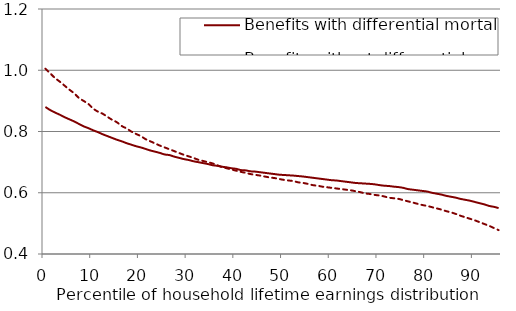
| Category | Benefits with differential mortality | Benefits without differential mortality |
|---|---|---|
| 0.0 | 0.88 | 1.005 |
| 1.0 | 0.87 | 0.99 |
| 2.0 | 0.862 | 0.975 |
| 3.0 | 0.855 | 0.963 |
| 4.0 | 0.847 | 0.95 |
| 5.0 | 0.84 | 0.937 |
| 6.0 | 0.833 | 0.925 |
| 7.0 | 0.825 | 0.91 |
| 8.0 | 0.817 | 0.9 |
| 9.0 | 0.811 | 0.89 |
| 10.0 | 0.804 | 0.875 |
| 11.0 | 0.798 | 0.865 |
| 12.0 | 0.791 | 0.858 |
| 13.0 | 0.785 | 0.848 |
| 14.0 | 0.779 | 0.838 |
| 15.0 | 0.773 | 0.83 |
| 16.0 | 0.768 | 0.818 |
| 17.0 | 0.762 | 0.81 |
| 18.0 | 0.757 | 0.8 |
| 19.0 | 0.752 | 0.792 |
| 20.0 | 0.748 | 0.785 |
| 21.0 | 0.743 | 0.775 |
| 22.0 | 0.738 | 0.768 |
| 23.0 | 0.734 | 0.761 |
| 24.0 | 0.73 | 0.754 |
| 25.0 | 0.725 | 0.748 |
| 26.0 | 0.723 | 0.742 |
| 27.0 | 0.718 | 0.736 |
| 28.0 | 0.714 | 0.73 |
| 29.0 | 0.71 | 0.724 |
| 30.0 | 0.707 | 0.719 |
| 31.0 | 0.703 | 0.714 |
| 32.0 | 0.7 | 0.708 |
| 33.0 | 0.697 | 0.704 |
| 34.0 | 0.694 | 0.7 |
| 35.0 | 0.69 | 0.696 |
| 36.0 | 0.688 | 0.69 |
| 37.0 | 0.685 | 0.684 |
| 38.0 | 0.683 | 0.68 |
| 39.0 | 0.68 | 0.676 |
| 40.0 | 0.678 | 0.672 |
| 41.0 | 0.674 | 0.668 |
| 42.0 | 0.673 | 0.665 |
| 43.0 | 0.67 | 0.661 |
| 44.0 | 0.669 | 0.658 |
| 45.0 | 0.667 | 0.656 |
| 46.0 | 0.665 | 0.653 |
| 47.0 | 0.663 | 0.65 |
| 48.0 | 0.661 | 0.648 |
| 49.0 | 0.659 | 0.645 |
| 50.0 | 0.658 | 0.642 |
| 51.0 | 0.657 | 0.64 |
| 52.0 | 0.656 | 0.638 |
| 53.0 | 0.655 | 0.634 |
| 54.0 | 0.653 | 0.632 |
| 55.0 | 0.651 | 0.629 |
| 56.0 | 0.649 | 0.625 |
| 57.0 | 0.647 | 0.623 |
| 58.0 | 0.645 | 0.62 |
| 59.0 | 0.643 | 0.618 |
| 60.0 | 0.641 | 0.616 |
| 61.0 | 0.64 | 0.614 |
| 62.0 | 0.638 | 0.612 |
| 63.0 | 0.636 | 0.61 |
| 64.0 | 0.634 | 0.608 |
| 65.0 | 0.632 | 0.605 |
| 66.0 | 0.631 | 0.602 |
| 67.0 | 0.63 | 0.598 |
| 68.0 | 0.629 | 0.596 |
| 69.0 | 0.628 | 0.593 |
| 70.0 | 0.625 | 0.591 |
| 71.0 | 0.623 | 0.588 |
| 72.0 | 0.622 | 0.584 |
| 73.0 | 0.62 | 0.582 |
| 74.0 | 0.618 | 0.58 |
| 75.0 | 0.616 | 0.576 |
| 76.0 | 0.612 | 0.572 |
| 77.0 | 0.61 | 0.568 |
| 78.0 | 0.608 | 0.564 |
| 79.0 | 0.606 | 0.56 |
| 80.0 | 0.604 | 0.557 |
| 81.0 | 0.6 | 0.553 |
| 82.0 | 0.597 | 0.549 |
| 83.0 | 0.594 | 0.545 |
| 84.0 | 0.59 | 0.54 |
| 85.0 | 0.587 | 0.536 |
| 86.0 | 0.584 | 0.531 |
| 87.0 | 0.58 | 0.525 |
| 88.0 | 0.577 | 0.52 |
| 89.0 | 0.574 | 0.515 |
| 90.0 | 0.57 | 0.51 |
| 91.0 | 0.566 | 0.504 |
| 92.0 | 0.562 | 0.498 |
| 93.0 | 0.557 | 0.492 |
| 94.0 | 0.554 | 0.485 |
| 95.0 | 0.55 | 0.478 |